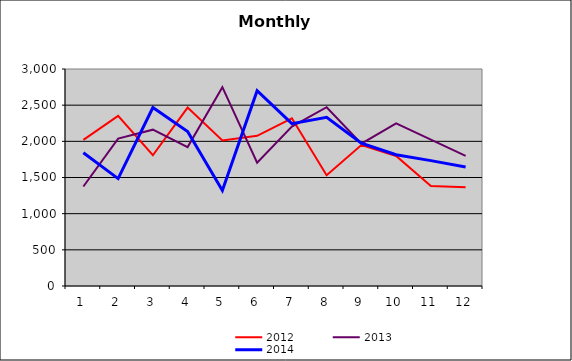
| Category | 2012 | 2013 | 2014 |
|---|---|---|---|
| 0 | 2020.89 | 1375.298 | 1842.078 |
| 1 | 2351.855 | 2038.391 | 1484.977 |
| 2 | 1807.378 | 2161.381 | 2467.773 |
| 3 | 2466.683 | 1919.971 | 2136.58 |
| 4 | 2012.063 | 2748.309 | 1319.681 |
| 5 | 2075.743 | 1705.243 | 2699.264 |
| 6 | 2318.054 | 2203.49 | 2244.473 |
| 7 | 1532.482 | 2471.28 | 2331.345 |
| 8 | 1949.159 | 1968.263 | 1975.102 |
| 9 | 1798.136 | 2248.057 | 1814.572 |
| 10 | 1382.248 | 2024.778 | 1733.08 |
| 11 | 1366.86 | 1799.99 | 1645.429 |